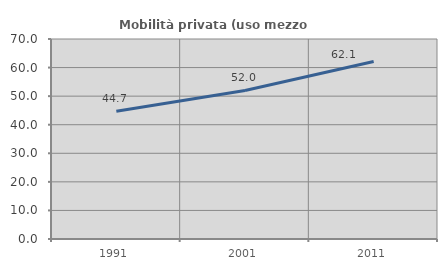
| Category | Mobilità privata (uso mezzo privato) |
|---|---|
| 1991.0 | 44.737 |
| 2001.0 | 51.982 |
| 2011.0 | 62.108 |